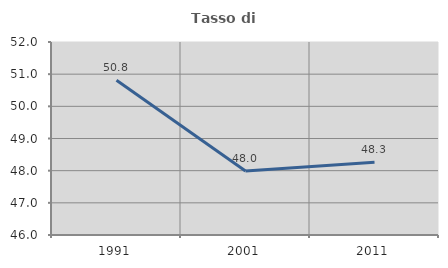
| Category | Tasso di occupazione   |
|---|---|
| 1991.0 | 50.81 |
| 2001.0 | 47.992 |
| 2011.0 | 48.263 |